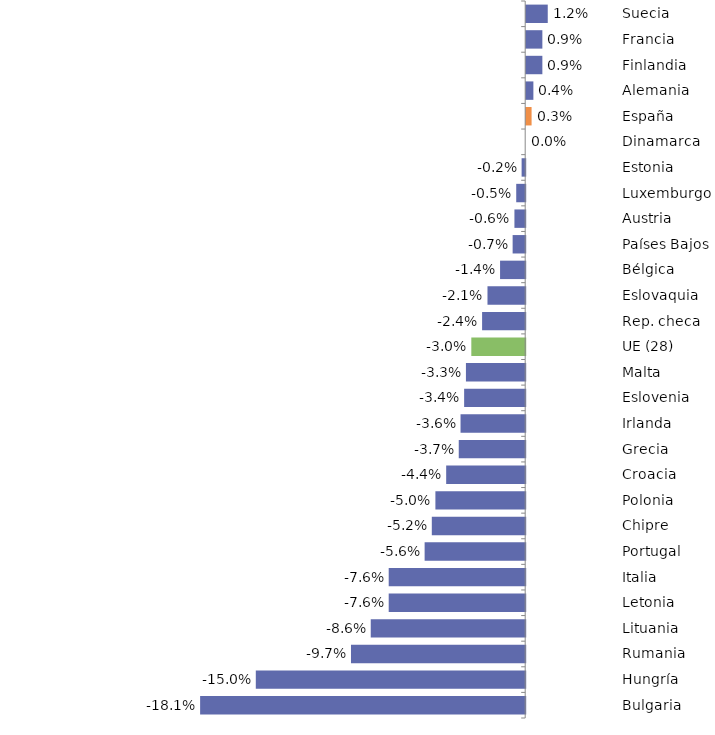
| Category | Series 1 |
|---|---|
| Bulgaria | -0.181 |
| Hungría | -0.15 |
| Rumania | -0.097 |
| Lituania | -0.086 |
| Letonia | -0.076 |
| Italia | -0.076 |
| Portugal | -0.056 |
| Chipre | -0.052 |
| Polonia | -0.05 |
| Croacia | -0.044 |
| Grecia | -0.037 |
| Irlanda | -0.036 |
| Eslovenia | -0.034 |
| Malta | -0.033 |
| UE (28) | -0.03 |
| Rep. checa | -0.024 |
| Eslovaquia | -0.021 |
| Bélgica | -0.014 |
| Países Bajos | -0.007 |
| Austria | -0.006 |
| Luxemburgo | -0.005 |
| Estonia | -0.002 |
| Dinamarca | 0 |
| España | 0.003 |
| Alemania | 0.004 |
| Finlandia | 0.009 |
| Francia | 0.009 |
| Suecia | 0.012 |